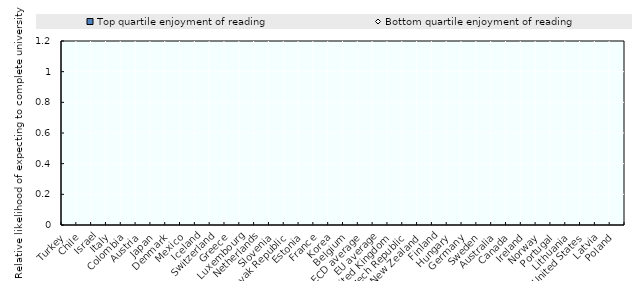
| Category | Top quartile enjoyment of reading |
|---|---|
| Turkey | 0.774 |
| Chile | 0.734 |
| Israel | 0.593 |
| Italy | 0.592 |
| Colombia | 0.524 |
| Austria | 0.522 |
| Japan | 0.52 |
| Denmark  | 0.473 |
| Mexico | 0.461 |
| Iceland | 0.446 |
| Switzerland | 0.439 |
| Greece | 0.431 |
| Luxembourg | 0.416 |
| Netherlands | 0.407 |
| Slovenia | 0.405 |
| Slovak Republic | 0.392 |
| Estonia | 0.37 |
| France | 0.361 |
| Korea | 0.34 |
| Belgium | 0.339 |
| OECD average | 0.338 |
| EU average | 0.325 |
| United Kingdom | 0.325 |
| Czech Republic | 0.321 |
| New Zealand | 0.315 |
| Finland | 0.282 |
| Hungary | 0.272 |
| Germany | 0.268 |
| Sweden | 0.256 |
| Australia | 0.254 |
| Canada | 0.235 |
| Ireland | 0.21 |
| Norway | 0.19 |
| Portugal | 0.182 |
| Lithuania | 0.174 |
| United States | 0.164 |
| Latvia | 0.162 |
| Poland | 0.154 |